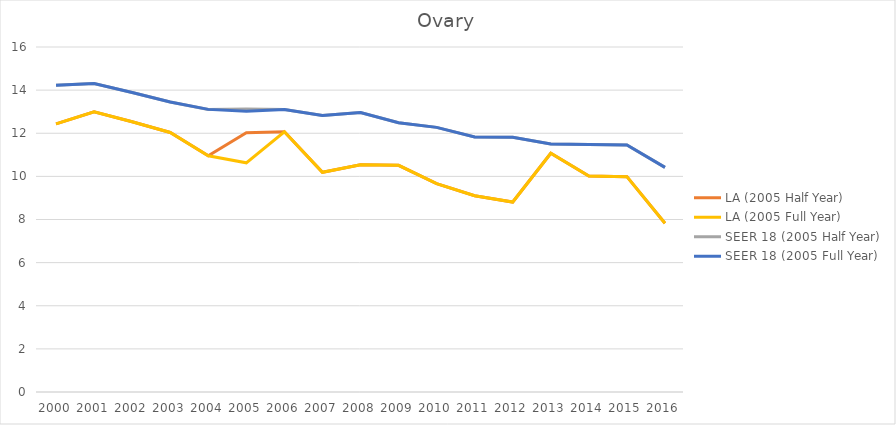
| Category | LA (2005 Half Year) | LA (2005 Full Year) | SEER 18 (2005 Half Year) | SEER 18 (2005 Full Year) |
|---|---|---|---|---|
| 2000.0 | 12.437 | 12.437 | 14.225 | 14.225 |
| 2001.0 | 12.993 | 12.993 | 14.302 | 14.302 |
| 2002.0 | 12.536 | 12.536 | 13.886 | 13.886 |
| 2003.0 | 12.037 | 12.037 | 13.449 | 13.449 |
| 2004.0 | 10.958 | 10.958 | 13.107 | 13.107 |
| 2005.0 | 12.027 | 10.628 | 13.123 | 13.016 |
| 2006.0 | 12.07 | 12.07 | 13.106 | 13.106 |
| 2007.0 | 10.189 | 10.189 | 12.828 | 12.828 |
| 2008.0 | 10.534 | 10.534 | 12.957 | 12.957 |
| 2009.0 | 10.515 | 10.515 | 12.49 | 12.49 |
| 2010.0 | 9.664 | 9.664 | 12.273 | 12.273 |
| 2011.0 | 9.102 | 9.102 | 11.826 | 11.826 |
| 2012.0 | 8.81 | 8.81 | 11.818 | 11.818 |
| 2013.0 | 11.073 | 11.073 | 11.503 | 11.503 |
| 2014.0 | 10.017 | 10.017 | 11.476 | 11.476 |
| 2015.0 | 9.987 | 9.987 | 11.457 | 11.457 |
| 2016.0 | 7.828 | 7.828 | 10.418 | 10.418 |